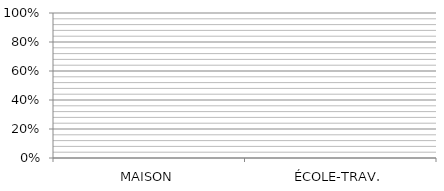
| Category | Series 0 | Series 1 | Series 2 | Series 3 | Series 4 | Series 5 | Series 6 | Series 7 |
|---|---|---|---|---|---|---|---|---|
| MAISON | 0 | 0 | 0 | 0 | 0 | 0 | 0 | 0 |
| ÉCOLE-TRAV. | 0 | 0 | 0 | 0 | 0 | 0 | 0 | 0 |